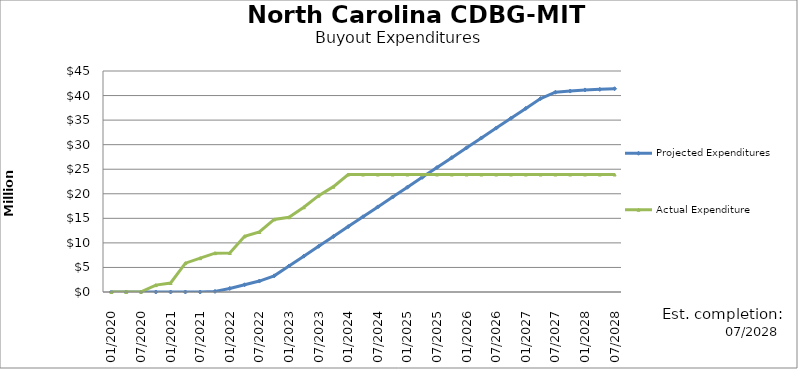
| Category | Projected Expenditures | Actual Expenditure |
|---|---|---|
| 01/2020 | 0 | 0 |
| 04/2020 | 0 | 0 |
| 07/2020 | 0 | 51196.5 |
| 10/2020 | 0 | 1396995.41 |
| 01/2021 | 0 | 1828831.36 |
| 04/2021 | 0 | 5869022.93 |
| 07/2021 | 0 | 6889035.93 |
| 10/2021 | 125000 | 7903076.08 |
| 01/2022 | 725000 | 7944165.05 |
| 04/2022 | 1475000 | 11338167.15 |
| 07/2022 | 2225000 | 12222903.41 |
| 10/2022 | 3285000 | 14775198.96 |
| 01/2023 | 5290848.136 | 15211645.54 |
| 04/2023 | 7296696.272 | 17252233.6 |
| 07/2023 | 9302544.409 | 19618576.57 |
| 10/2023 | 11308392.545 | 21450318.07 |
| 01/2024 | 13314240.681 | 23920379.64 |
| 04/2024 | 15320088.817 | 23920379.64 |
| 07/2024 | 17325936.953 | 23920379.64 |
| 10/2024 | 19331785.09 | 23920379.64 |
| 01/2025 | 21337633.226 | 23920379.64 |
| 04/2025 | 23343481.362 | 23920379.64 |
| 07/2025 | 25349329.498 | 23920379.64 |
| 10/2025 | 27355177.634 | 23920379.64 |
| 01/2026 | 29361025.77 | 23920379.64 |
| 04/2026 | 31366873.907 | 23920379.64 |
| 07/2026 | 33372722.043 | 23920379.64 |
| 10/2026 | 35378570.179 | 23920379.64 |
| 01/2027 | 37384418.315 | 23920379.64 |
| 04/2027 | 39390266.451 | 23920379.64 |
| 07/2027 | 40680959.451 | 23920379.64 |
| 10/2027 | 40913046.121 | 23920379.64 |
| 01/2028 | 41145132.791 | 23920379.64 |
| 04/2028 | 41261175.791 | 23920379.64 |
| 07/2028 | 41391773.126 | 23920379.64 |